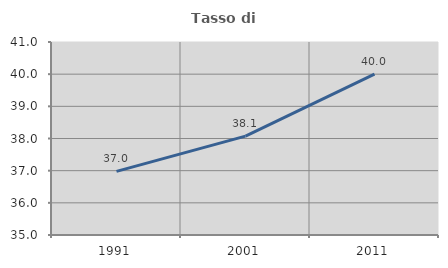
| Category | Tasso di occupazione   |
|---|---|
| 1991.0 | 36.978 |
| 2001.0 | 38.072 |
| 2011.0 | 40 |